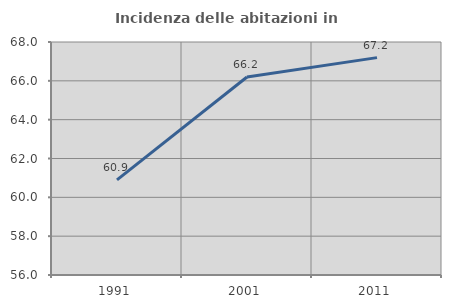
| Category | Incidenza delle abitazioni in proprietà  |
|---|---|
| 1991.0 | 60.898 |
| 2001.0 | 66.2 |
| 2011.0 | 67.196 |